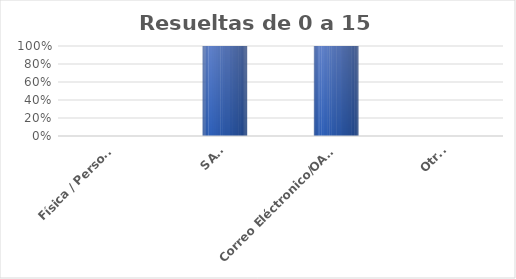
| Category | Series 0 |
|---|---|
| Física / Personal | 0 |
| SAIP | 5 |
| Correo Eléctronico/OAI/Info/Contacto | 14 |
| Otras | 0 |